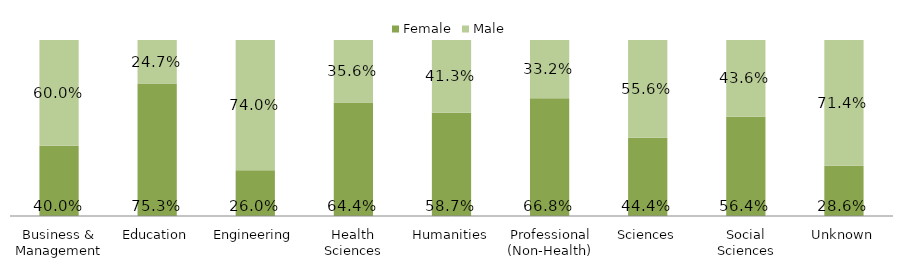
| Category | Female | Male |
|---|---|---|
| Business & Management | 0.4 | 0.6 |
| Education | 0.753 | 0.247 |
| Engineering | 0.26 | 0.74 |
| Health Sciences | 0.644 | 0.356 |
| Humanities | 0.587 | 0.413 |
| Professional (Non-Health) | 0.668 | 0.332 |
| Sciences | 0.444 | 0.556 |
| Social Sciences | 0.564 | 0.436 |
| Unknown | 0.286 | 0.714 |